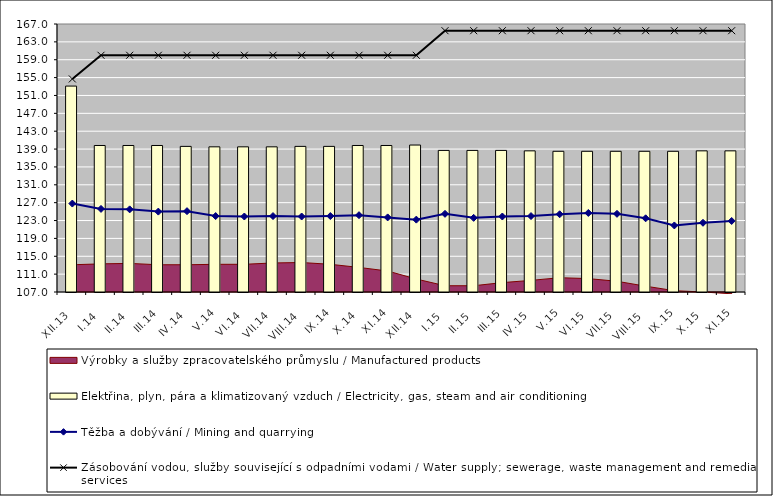
| Category | Elektřina, plyn, pára a klimatizovaný vzduch / Electricity, gas, steam and air conditioning |
|---|---|
| XII.13 | 153.1 |
| I.14 | 139.8 |
| II.14 | 139.8 |
| III.14 | 139.8 |
| IV.14 | 139.6 |
| V.14 | 139.5 |
| VI.14 | 139.5 |
| VII.14 | 139.5 |
| VIII.14 | 139.6 |
| IX.14 | 139.6 |
| X.14 | 139.8 |
| XI.14 | 139.8 |
| XII.14 | 139.9 |
| I.15 | 138.7 |
| II.15 | 138.7 |
| III.15 | 138.7 |
| IV.15 | 138.6 |
| V.15 | 138.5 |
| VI.15 | 138.5 |
| VII.15 | 138.5 |
| VIII.15 | 138.5 |
| IX.15 | 138.5 |
| X.15 | 138.6 |
| XI.15 | 138.6 |